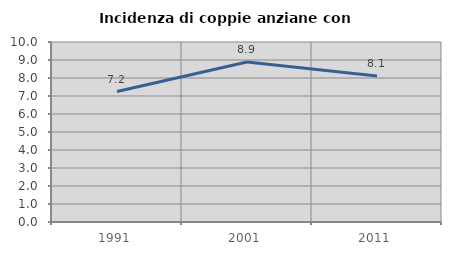
| Category | Incidenza di coppie anziane con figli |
|---|---|
| 1991.0 | 7.246 |
| 2001.0 | 8.889 |
| 2011.0 | 8.108 |